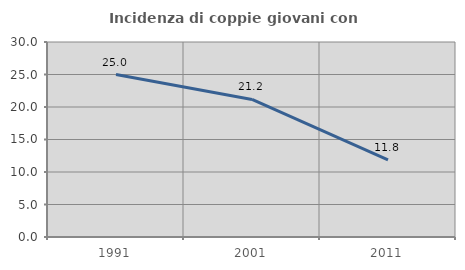
| Category | Incidenza di coppie giovani con figli |
|---|---|
| 1991.0 | 25 |
| 2001.0 | 21.158 |
| 2011.0 | 11.849 |